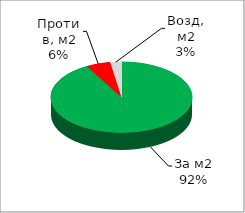
| Category | Series 0 |
|---|---|
| За м2 | 0.919 |
| Против, м2 | 0.056 |
| Возд, м2 | 0.026 |